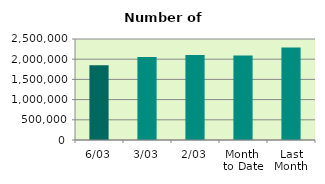
| Category | Series 0 |
|---|---|
| 6/03 | 1853026 |
| 3/03 | 2053816 |
| 2/03 | 2104354 |
| Month 
to Date | 2092172.5 |
| Last
Month | 2290810.7 |